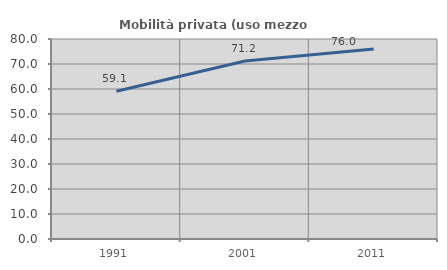
| Category | Mobilità privata (uso mezzo privato) |
|---|---|
| 1991.0 | 59.083 |
| 2001.0 | 71.188 |
| 2011.0 | 76.044 |